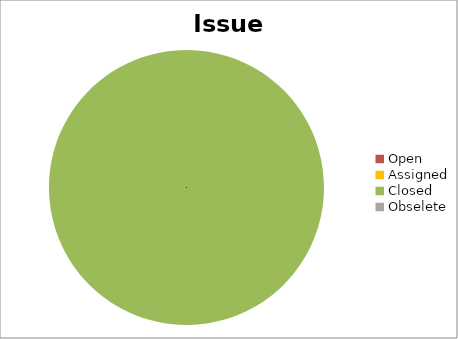
| Category | Issue Status |
|---|---|
| Open | 0 |
| Assigned | 0 |
| Closed | 6 |
| Obselete | 0 |